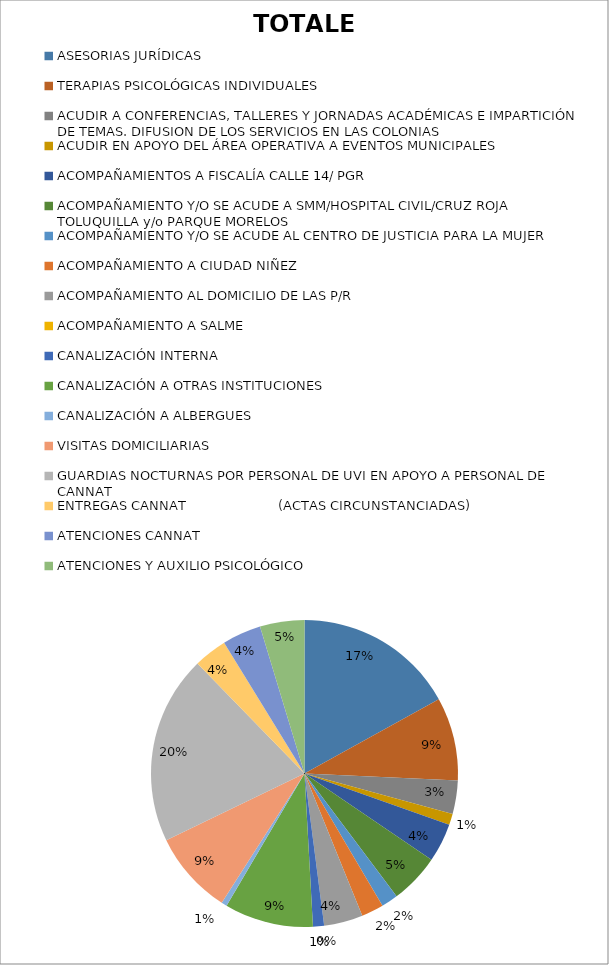
| Category | TOTALES |
|---|---|
| ASESORIAS JURÍDICAS | 29 |
| TERAPIAS PSICOLÓGICAS INDIVIDUALES | 15 |
| ACUDIR A CONFERENCIAS, TALLERES Y JORNADAS ACADÉMICAS E IMPARTICIÓN DE TEMAS. DIFUSION DE LOS SERVICIOS EN LAS COLONIAS | 6 |
| ACUDIR EN APOYO DEL ÁREA OPERATIVA A EVENTOS MUNICIPALES  | 2 |
| ACOMPAÑAMIENTOS A FISCALÍA CALLE 14/ PGR | 7 |
| ACOMPAÑAMIENTO Y/O SE ACUDE A SMM/HOSPITAL CIVIL/CRUZ ROJA TOLUQUILLA y/o PARQUE MORELOS | 9 |
| ACOMPAÑAMIENTO Y/O SE ACUDE AL CENTRO DE JUSTICIA PARA LA MUJER | 3 |
| ACOMPAÑAMIENTO A CIUDAD NIÑEZ  | 4 |
| ACOMPAÑAMIENTO AL DOMICILIO DE LAS P/R | 7 |
| ACOMPAÑAMIENTO A SALME | 0 |
| CANALIZACIÓN INTERNA | 2 |
| CANALIZACIÓN A OTRAS INSTITUCIONES | 16 |
| CANALIZACIÓN A ALBERGUES | 1 |
| VISITAS DOMICILIARIAS  | 15 |
| GUARDIAS NOCTURNAS POR PERSONAL DE UVI EN APOYO A PERSONAL DE CANNAT | 34 |
| ENTREGAS CANNAT                       (ACTAS CIRCUNSTANCIADAS) | 6 |
| ATENCIONES CANNAT | 7 |
| ATENCIONES Y AUXILIO PSICOLÓGICO | 8 |